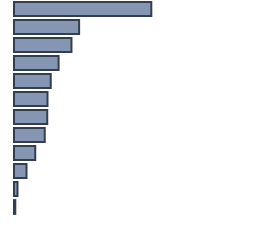
| Category | Percentatge |
|---|---|
| 0 | 57.21 |
| 1 | 27.133 |
| 2 | 23.943 |
| 3 | 18.579 |
| 4 | 15.311 |
| 5 | 13.992 |
| 6 | 13.842 |
| 7 | 12.86 |
| 8 | 8.807 |
| 9 | 5.158 |
| 10 | 1.483 |
| 11 | 0.542 |